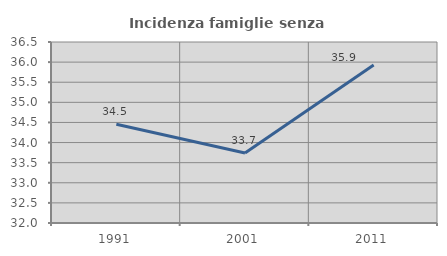
| Category | Incidenza famiglie senza nuclei |
|---|---|
| 1991.0 | 34.457 |
| 2001.0 | 33.742 |
| 2011.0 | 35.929 |